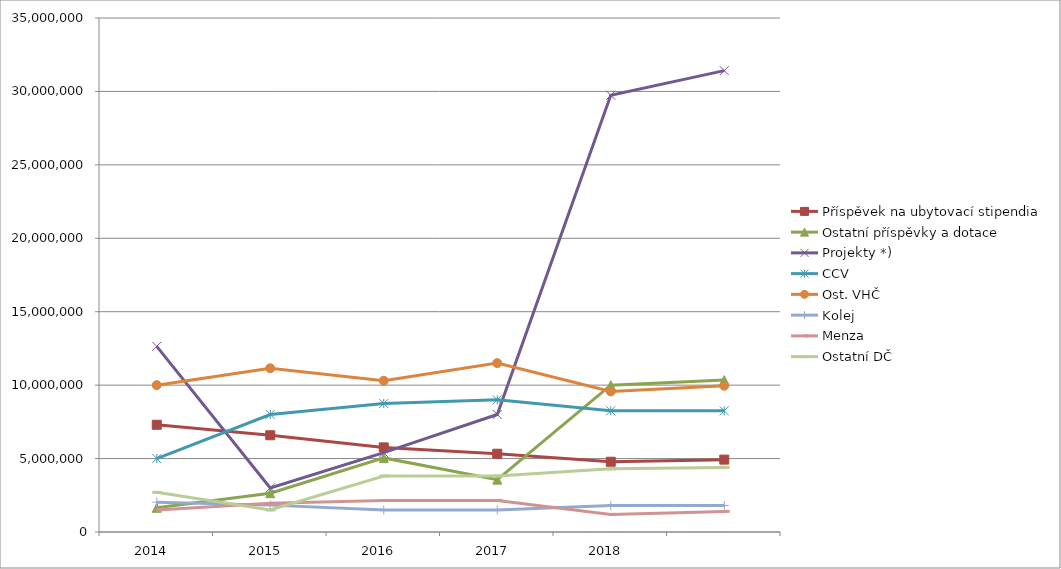
| Category | Příspěvek na ubytovací stipendia | Ostatní příspěvky a dotace | Projekty *) | CCV | Ost. VHČ | Kolej | Menza | Ostatní DČ |
|---|---|---|---|---|---|---|---|---|
| 2014.0 | 7301000 | 1650000 | 12640000 | 5000000 | 9998231 | 2030000 | 1500000 | 2700000 |
| 2015.0 | 6588000 | 2642000 | 3000000 | 8000000 | 11150000 | 1830000 | 1950000 | 1500000 |
| 2016.0 | 5762000 | 5044800 | 5400000 | 8750000 | 10300000 | 1500000 | 2150000 | 3810000 |
| 2017.0 | 5329800 | 3565500 | 8000000 | 9000000 | 11500000 | 1500000 | 2150000 | 3810000 |
| 2018.0 | 4784400 | 9995000 | 29737020 | 8250000 | 9571000 | 1800000 | 1200000 | 4300000 |